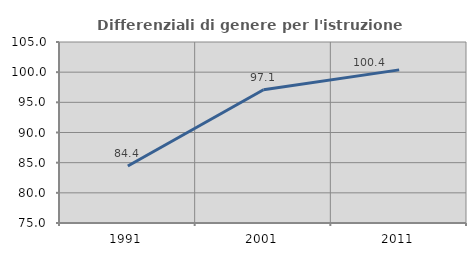
| Category | Differenziali di genere per l'istruzione superiore |
|---|---|
| 1991.0 | 84.446 |
| 2001.0 | 97.075 |
| 2011.0 | 100.382 |